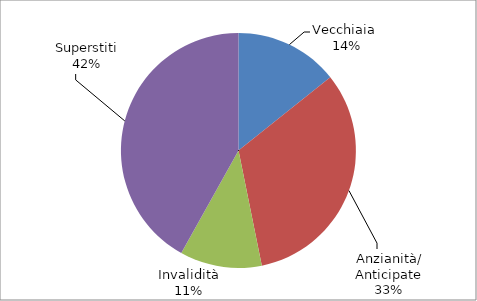
| Category | Series 0 |
|---|---|
| Vecchiaia  | 32091 |
| Anzianità/ Anticipate | 73209 |
| Invalidità | 25366 |
| Superstiti | 94243 |